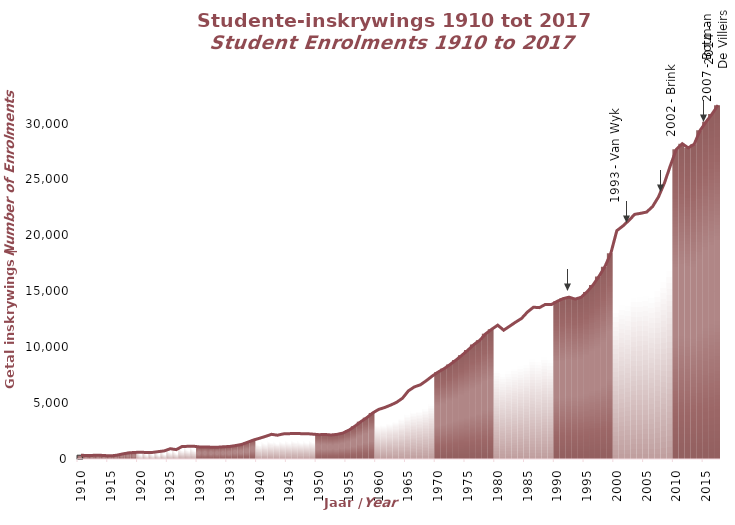
| Category | Studente |
|---|---|
| 1910.0 | 340 |
| 1911.0 | 304 |
| 1912.0 | 324 |
| 1913.0 | 341 |
| 1914.0 | 307 |
| 1915.0 | 280 |
| 1916.0 | 337 |
| 1917.0 | 453 |
| 1918.0 | 548 |
| 1919.0 | 587 |
| 1920.0 | 606 |
| 1921.0 | 583 |
| 1922.0 | 588 |
| 1923.0 | 660 |
| 1924.0 | 726 |
| 1925.0 | 919 |
| 1926.0 | 838 |
| 1927.0 | 1123 |
| 1928.0 | 1131 |
| 1929.0 | 1137 |
| 1930.0 | 1074 |
| 1931.0 | 1084 |
| 1932.0 | 1050 |
| 1933.0 | 1057 |
| 1934.0 | 1094 |
| 1935.0 | 1121 |
| 1936.0 | 1206 |
| 1937.0 | 1303 |
| 1938.0 | 1500 |
| 1939.0 | 1703 |
| 1940.0 | 1856 |
| 1941.0 | 2023 |
| 1942.0 | 2207 |
| 1943.0 | 2127 |
| 1944.0 | 2246 |
| 1945.0 | 2268 |
| 1946.0 | 2281 |
| 1947.0 | 2267 |
| 1948.0 | 2263 |
| 1949.0 | 2221 |
| 1950.0 | 2175 |
| 1951.0 | 2196 |
| 1952.0 | 2147 |
| 1953.0 | 2201 |
| 1954.0 | 2319 |
| 1955.0 | 2578 |
| 1956.0 | 2928 |
| 1957.0 | 3335 |
| 1958.0 | 3694 |
| 1959.0 | 4117 |
| 1960.0 | 4435 |
| 1961.0 | 4602 |
| 1962.0 | 4818 |
| 1963.0 | 5065 |
| 1964.0 | 5436 |
| 1965.0 | 6096 |
| 1966.0 | 6449 |
| 1967.0 | 6631 |
| 1968.0 | 7002 |
| 1969.0 | 7416 |
| 1970.0 | 7778 |
| 1971.0 | 8082 |
| 1972.0 | 8451 |
| 1973.0 | 8850 |
| 1974.0 | 9284 |
| 1975.0 | 9742 |
| 1976.0 | 10238 |
| 1977.0 | 10623 |
| 1978.0 | 11207 |
| 1979.0 | 11604 |
| 1980.0 | 11969 |
| 1981.0 | 11519 |
| 1982.0 | 11878 |
| 1983.0 | 12237 |
| 1984.0 | 12571 |
| 1985.0 | 13149 |
| 1986.0 | 13573 |
| 1987.0 | 13536 |
| 1988.0 | 13827 |
| 1989.0 | 13807 |
| 1990.0 | 14104 |
| 1991.0 | 14347 |
| 1992.0 | 14473 |
| 1993.0 | 14298 |
| 1994.0 | 14462 |
| 1995.0 | 14946 |
| 1996.0 | 15555 |
| 1997.0 | 16327 |
| 1998.0 | 17200 |
| 1999.0 | 18404 |
| 2000.0 | 20421 |
| 2001.0 | 20828 |
| 2002.0 | 21324 |
| 2003.0 | 21879 |
| 2004.0 | 21972 |
| 2005.0 | 22082 |
| 2006.0 | 22569 |
| 2007.0 | 23439 |
| 2008.0 | 24686 |
| 2009.0 | 26243 |
| 2010.0 | 27694 |
| 2011.0 | 28193 |
| 2012.0 | 27823 |
| 2013.0 | 28156 |
| 2014.0 | 29393 |
| 2015.0 | 30150 |
| 2016.0 | 30854 |
| 2017.0 | 31639 |